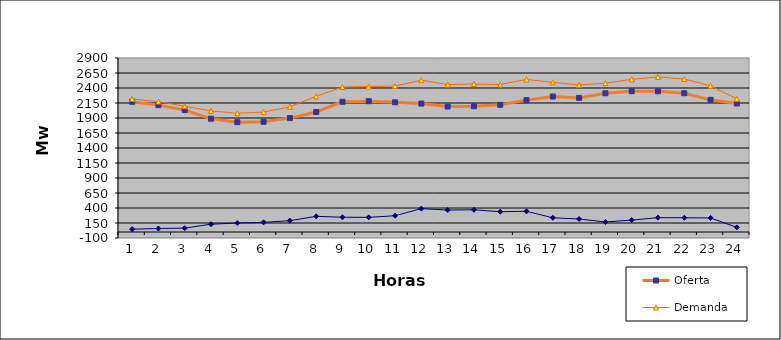
| Category | Oferta | Demanda | No Servida |
|---|---|---|---|
| 1.0 | 2170.03 | 2217.314 | 47.284 |
| 2.0 | 2114.64 | 2173.059 | 58.419 |
| 3.0 | 2031.81 | 2096.149 | 64.339 |
| 4.0 | 1888.32 | 2018.282 | 129.962 |
| 5.0 | 1830.46 | 1979.931 | 149.471 |
| 6.0 | 1836.73 | 1997.919 | 161.189 |
| 7.0 | 1898.42 | 2086.683 | 188.263 |
| 8.0 | 2000.26 | 2261.575 | 261.315 |
| 9.0 | 2170.88 | 2416.409 | 245.529 |
| 10.0 | 2179.56 | 2424.066 | 244.506 |
| 11.0 | 2161.46 | 2432.773 | 271.313 |
| 12.0 | 2140.43 | 2530.033 | 389.603 |
| 13.0 | 2090.58 | 2456.293 | 365.713 |
| 14.0 | 2096.08 | 2466.906 | 370.826 |
| 15.0 | 2119.71 | 2457.094 | 337.384 |
| 16.0 | 2198.05 | 2543.378 | 345.328 |
| 17.0 | 2257.91 | 2494.463 | 236.553 |
| 18.0 | 2235.07 | 2451.788 | 216.718 |
| 19.0 | 2311.95 | 2478.664 | 166.714 |
| 20.0 | 2346.65 | 2545.142 | 198.492 |
| 21.0 | 2345.2 | 2584.053 | 238.853 |
| 22.0 | 2312.44 | 2549.665 | 237.225 |
| 23.0 | 2202.43 | 2436.65 | 234.22 |
| 24.0 | 2142.33 | 2219.58 | 77.25 |